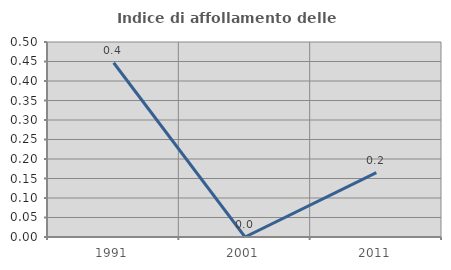
| Category | Indice di affollamento delle abitazioni  |
|---|---|
| 1991.0 | 0.447 |
| 2001.0 | 0 |
| 2011.0 | 0.165 |